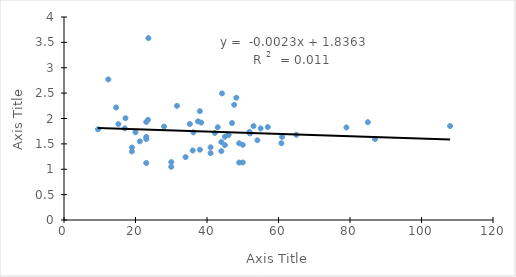
| Category | Series 0 |
|---|---|
| 9.5 | 1.788 |
| 12.4 | 2.77 |
| 14.6 | 2.217 |
| 15.2 | 1.89 |
| 17.0 | 1.806 |
| 17.2 | 2.006 |
| 19.0 | 1.352 |
| 19.0 | 1.427 |
| 20.0 | 1.728 |
| 21.2 | 1.55 |
| 23.0 | 1.931 |
| 23.0 | 1.594 |
| 23.0 | 1.123 |
| 23.0 | 1.637 |
| 23.5 | 1.973 |
| 23.6 | 3.584 |
| 28.0 | 1.841 |
| 30.0 | 1.048 |
| 30.0 | 1.142 |
| 31.6 | 2.249 |
| 34.0 | 1.239 |
| 35.2 | 1.892 |
| 36.0 | 1.37 |
| 36.2 | 1.726 |
| 37.5 | 1.943 |
| 38.0 | 2.145 |
| 38.0 | 1.385 |
| 38.4 | 1.92 |
| 41.0 | 1.317 |
| 41.0 | 1.432 |
| 42.2 | 1.715 |
| 43.0 | 1.828 |
| 44.0 | 1.537 |
| 44.0 | 1.357 |
| 44.2 | 2.495 |
| 45.0 | 1.64 |
| 45.0 | 1.476 |
| 46.0 | 1.676 |
| 46.0 | 1.676 |
| 47.0 | 1.91 |
| 47.6 | 2.27 |
| 48.2 | 2.41 |
| 49.0 | 1.512 |
| 49.0 | 1.131 |
| 50.0 | 1.134 |
| 50.0 | 1.481 |
| 51.9 | 1.738 |
| 52.0 | 1.706 |
| 53.0 | 1.851 |
| 54.1 | 1.571 |
| 55.0 | 1.804 |
| 57.0 | 1.832 |
| 60.8 | 1.513 |
| 61.0 | 1.638 |
| 65.0 | 1.68 |
| 79.0 | 1.824 |
| 85.0 | 1.927 |
| 87.0 | 1.596 |
| 108.0 | 1.852 |